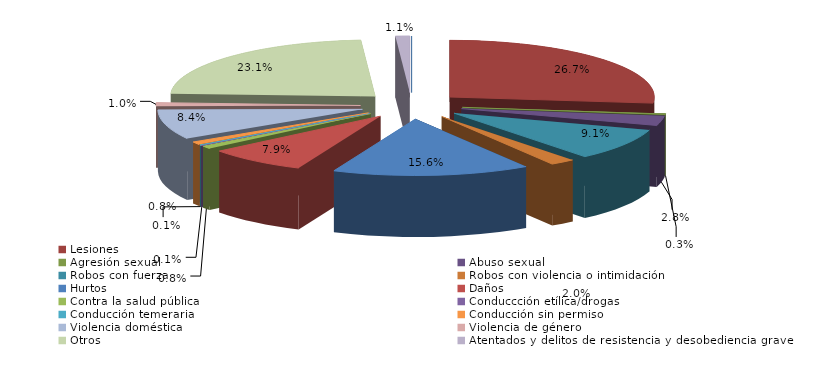
| Category | Series 0 |
|---|---|
| Homicidio/Asesinato dolosos | 0 |
| Lesiones | 190 |
| Agresión sexual | 2 |
| Abuso sexual | 20 |
| Robos con fuerza | 65 |
| Robos con violencia o intimidación | 14 |
| Hurtos | 111 |
| Daños | 56 |
| Contra la salud pública | 6 |
| Conduccción etílica/drogas | 1 |
| Conducción temeraria | 1 |
| Conducción sin permiso | 6 |
| Violencia doméstica | 60 |
| Violencia de género | 7 |
| Otros | 164 |
| Atentados y delitos de resistencia y desobediencia grave | 8 |
| Otros delitos contra el orden público | 0 |